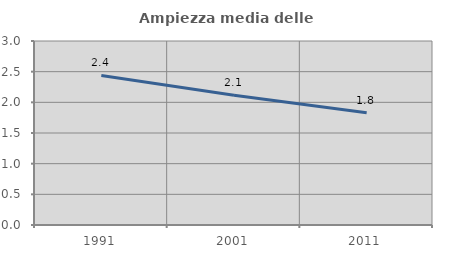
| Category | Ampiezza media delle famiglie |
|---|---|
| 1991.0 | 2.439 |
| 2001.0 | 2.117 |
| 2011.0 | 1.832 |